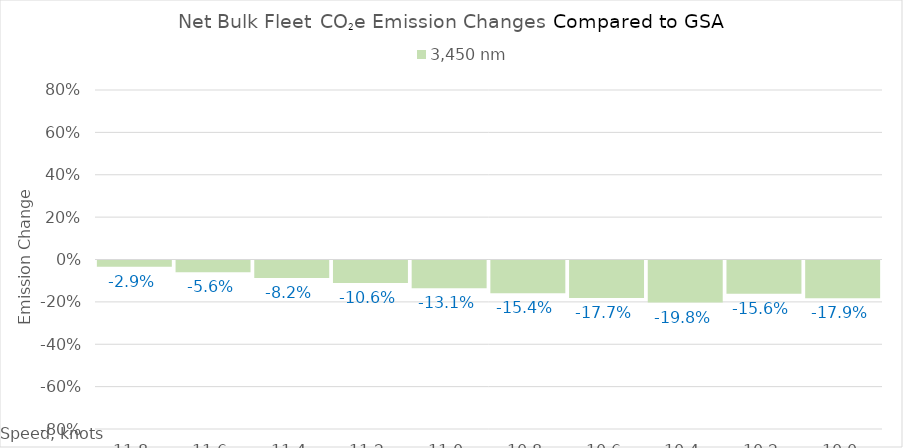
| Category | 3,450 |
|---|---|
| 11.8 | -0.029 |
| 11.600000000000001 | -0.056 |
| 11.400000000000002 | -0.082 |
| 11.200000000000003 | -0.106 |
| 11.000000000000004 | -0.131 |
| 10.800000000000004 | -0.154 |
| 10.600000000000005 | -0.177 |
| 10.400000000000006 | -0.198 |
| 10.200000000000006 | -0.156 |
| 10.000000000000007 | -0.179 |